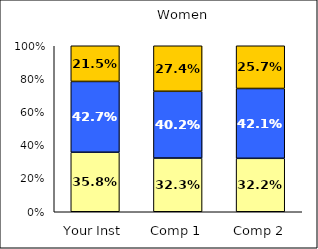
| Category | Low Habits of Mind | Average Habits of Mind | High Habits of Mind |
|---|---|---|---|
| Your Inst | 0.358 | 0.427 | 0.215 |
| Comp 1 | 0.323 | 0.402 | 0.274 |
| Comp 2 | 0.322 | 0.421 | 0.257 |